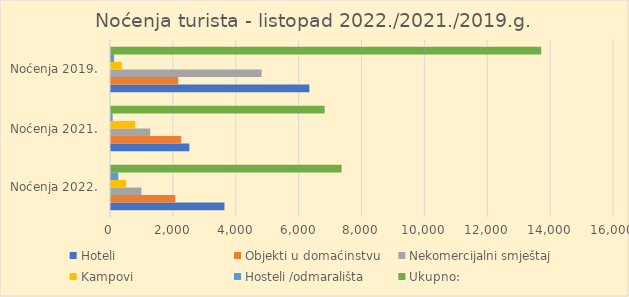
| Category | Hoteli | Objekti u domaćinstvu | Nekomercijalni smještaj | Kampovi | Hosteli /odmarališta | Ukupno: |
|---|---|---|---|---|---|---|
| Noćenja 2022. | 3609 | 2044 | 969 | 481 | 231 | 7334 |
| Noćenja 2021. | 2493 | 2231 | 1249 | 770 | 52 | 6795 |
| Noćenja 2019. | 6310 | 2139 | 4790 | 346 | 100 | 13685 |